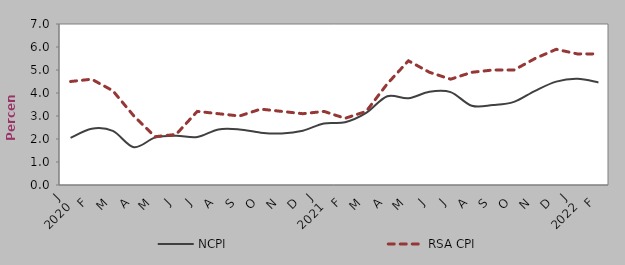
| Category | NCPI | RSA CPI |
|---|---|---|
| 0 | 2.05 | 4.5 |
| 1900-01-01 | 2.45 | 4.6 |
| 1900-01-02 | 2.354 | 4.1 |
| 1900-01-03 | 1.643 | 3 |
| 1900-01-04 | 2.06 | 2.1 |
| 1900-01-05 | 2.145 | 2.2 |
| 1900-01-06 | 2.087 | 3.2 |
| 1900-01-07 | 2.416 | 3.1 |
| 1900-01-08 | 2.416 | 3 |
| 1900-01-09 | 2.277 | 3.3 |
| 1900-01-10 | 2.242 | 3.2 |
| 1900-01-11 | 2.361 | 3.1 |
| 1900-01-12 | 2.676 | 3.2 |
| 1900-01-13 | 2.728 | 2.9 |
| 1900-01-14 | 3.133 | 3.2 |
| 1900-01-15 | 3.861 | 4.4 |
| 1900-01-16 | 3.769 | 5.4 |
| 1900-01-17 | 4.057 | 4.9 |
| 1900-01-18 | 4.038 | 4.6 |
| 1900-01-19 | 3.445 | 4.9 |
| 1900-01-20 | 3.474 | 5 |
| 1900-01-21 | 3.612 | 5 |
| 1900-01-22 | 4.095 | 5.5 |
| 1900-01-23 | 4.494 | 5.9 |
| 1900-01-24 | 4.618 | 5.7 |
| 1900-01-25 | 4.46 | 5.7 |